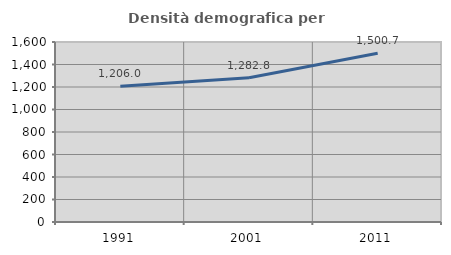
| Category | Densità demografica |
|---|---|
| 1991.0 | 1205.958 |
| 2001.0 | 1282.816 |
| 2011.0 | 1500.653 |